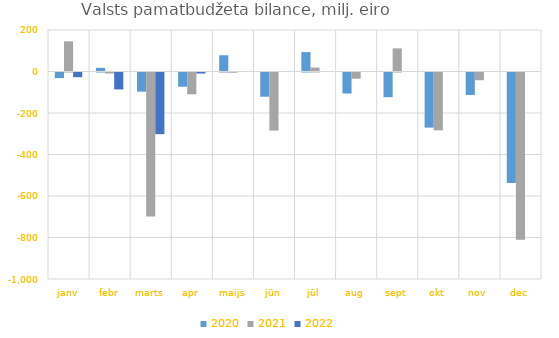
| Category | 2020 | 2021 | 2022 |
|---|---|---|---|
| janv | -27008.783 | 145495.451 | -22576.613 |
| febr | 17739.259 | -4522.432 | -81631.044 |
| marts | -92437.362 | -694525.982 | -297136.226 |
| apr | -68618.758 | -104877.798 | -5088.903 |
| maijs | 78305.058 | -1156.411 | 0 |
| jūn | -116676.414 | -279832.241 | 0 |
| jūl | 93597.468 | 19028.311 | 0 |
| aug | -101242.931 | -30047.233 | 0 |
| sept | -118985.258 | 111497.077 | 0 |
| okt | -265582.087 | -278801.691 | 0 |
| nov | -108180.558 | -37283.727 | 0 |
| dec | -532871.659 | -805850.118 | 0 |